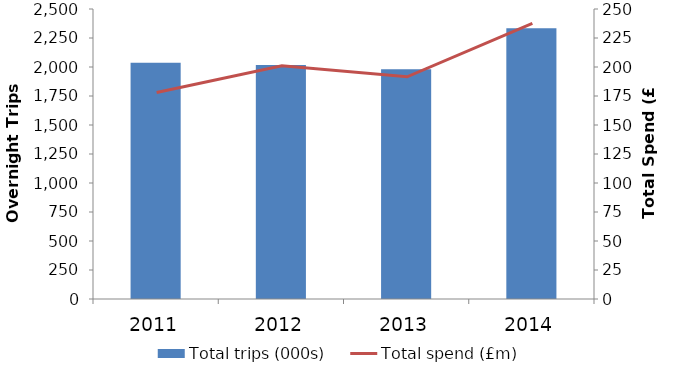
| Category | Total trips (000s) |
|---|---|
| 2011.0 | 2036.136 |
| 2012.0 | 2018.069 |
| 2013.0 | 1980.17 |
| 2014.0 | 2334.627 |